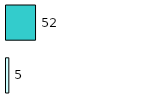
| Category | Series 0 | Series 1 |
|---|---|---|
| 0 | 5 | 52 |